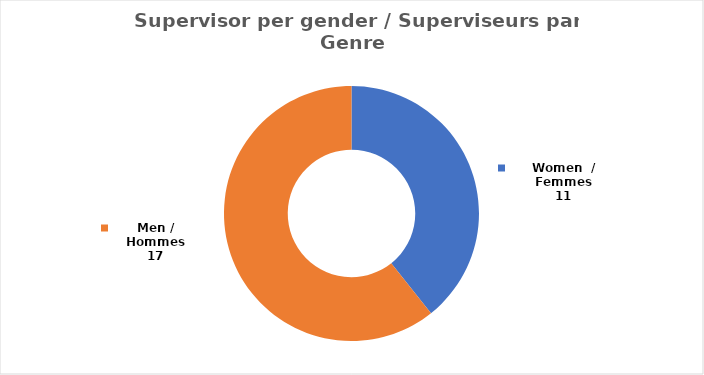
| Category | Series 0 |
|---|---|
| Women  / Femmes | 11 |
| Men / Hommes | 17 |